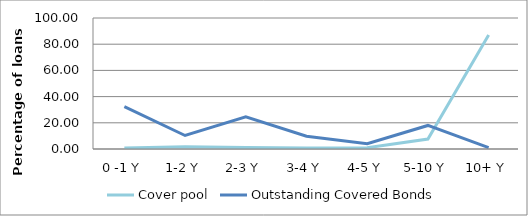
| Category | Cover pool | Outstanding Covered Bonds |
|---|---|---|
| 0 -1 Y | 0.846 | 32.335 |
| 1-2 Y | 1.698 | 10.301 |
| 2-3 Y | 1.077 | 24.484 |
| 3-4 Y | 0.725 | 9.794 |
| 4-5 Y | 0.967 | 4.019 |
| 5-10 Y | 7.607 | 17.978 |
| 10+ Y | 87.08 | 1.088 |